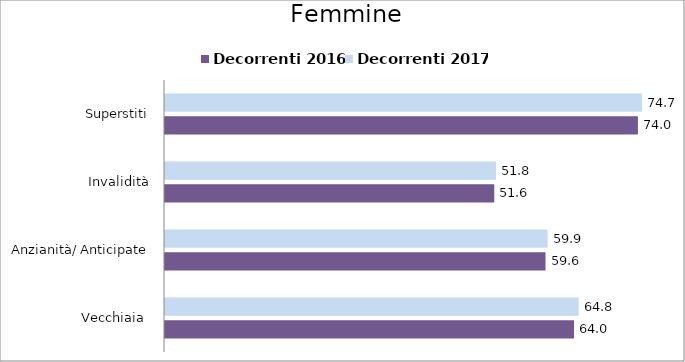
| Category | Decorrenti 2016 | Decorrenti 2017 |
|---|---|---|
| Vecchiaia  | 64.04 | 64.76 |
| Anzianità/ Anticipate | 59.57 | 59.9 |
| Invalidità | 51.55 | 51.83 |
| Superstiti | 74.04 | 74.66 |